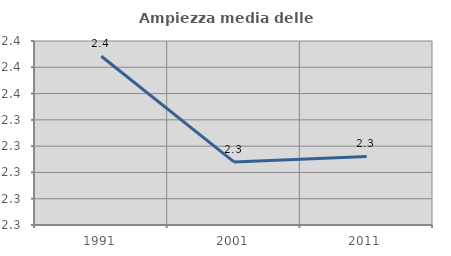
| Category | Ampiezza media delle famiglie |
|---|---|
| 1991.0 | 2.388 |
| 2001.0 | 2.308 |
| 2011.0 | 2.312 |